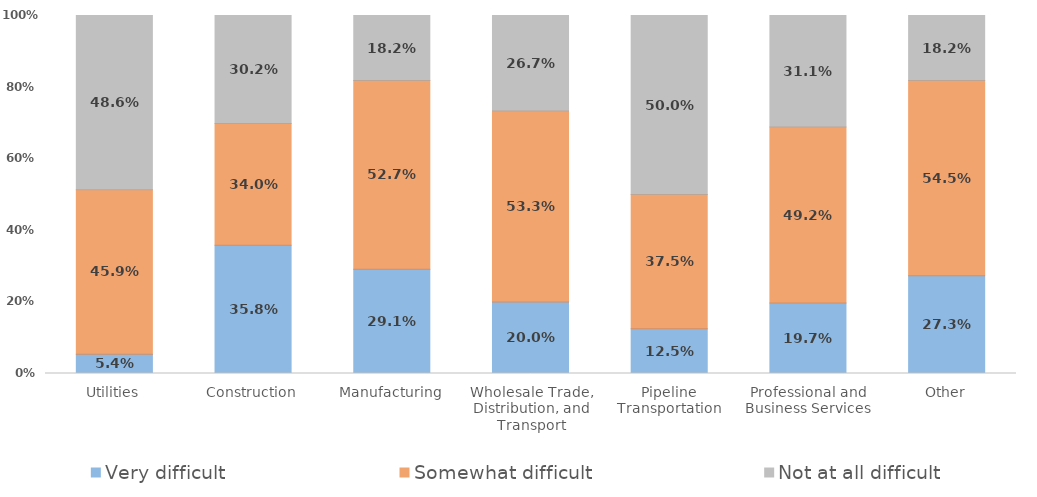
| Category | Very difficult | Somewhat difficult | Not at all difficult |
|---|---|---|---|
| Utilities | 0.054 | 0.459 | 0.486 |
| Construction | 0.358 | 0.34 | 0.302 |
| Manufacturing | 0.291 | 0.527 | 0.182 |
| Wholesale Trade, Distribution, and Transport | 0.2 | 0.533 | 0.267 |
| Pipeline Transportation | 0.125 | 0.375 | 0.5 |
| Professional and Business Services | 0.197 | 0.492 | 0.311 |
| Other | 0.273 | 0.545 | 0.182 |